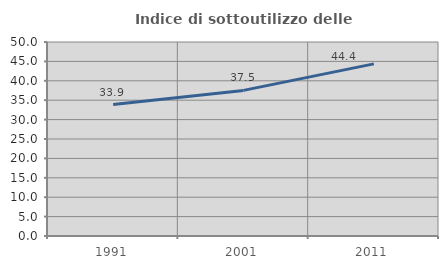
| Category | Indice di sottoutilizzo delle abitazioni  |
|---|---|
| 1991.0 | 33.879 |
| 2001.0 | 37.527 |
| 2011.0 | 44.368 |